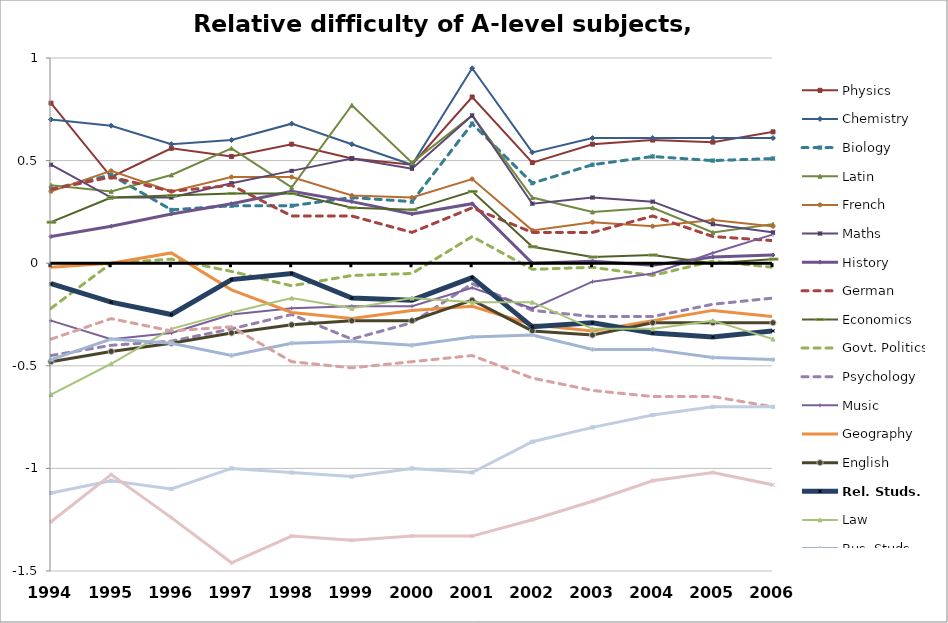
| Category | Physics | Chemistry | Biology | Latin | French | Maths | History | German | Economics | Govt. Politics | Psychology | Music | Geography | English | Rel. Studs. | Law | Bus. Studs. | Sociology | Art | Photography |
|---|---|---|---|---|---|---|---|---|---|---|---|---|---|---|---|---|---|---|---|---|
| 1994.0 | 0.78 | 0.7 | 0.36 | 0.38 | 0.35 | 0.48 | 0.13 | 0.36 | 0.2 | -0.22 | -0.45 | -0.28 | -0.02 | -0.48 | -0.1 | -0.64 | -0.47 | -0.37 | -1.12 | -1.26 |
| 1995.0 | 0.42 | 0.67 | 0.43 | 0.35 | 0.45 | 0.32 | 0.18 | 0.42 | 0.32 | 0 | -0.4 | -0.37 | 0 | -0.43 | -0.19 | -0.49 | -0.37 | -0.27 | -1.06 | -1.03 |
| 1996.0 | 0.56 | 0.58 | 0.26 | 0.43 | 0.35 | 0.32 | 0.24 | 0.35 | 0.33 | 0.02 | -0.38 | -0.34 | 0.05 | -0.39 | -0.25 | -0.32 | -0.39 | -0.33 | -1.1 | -1.24 |
| 1997.0 | 0.52 | 0.6 | 0.28 | 0.56 | 0.42 | 0.39 | 0.29 | 0.38 | 0.34 | -0.04 | -0.32 | -0.25 | -0.13 | -0.34 | -0.08 | -0.24 | -0.45 | -0.31 | -1 | -1.46 |
| 1998.0 | 0.58 | 0.68 | 0.28 | 0.37 | 0.42 | 0.45 | 0.35 | 0.23 | 0.34 | -0.11 | -0.25 | -0.22 | -0.24 | -0.3 | -0.05 | -0.17 | -0.39 | -0.48 | -1.02 | -1.33 |
| 1999.0 | 0.51 | 0.58 | 0.32 | 0.77 | 0.33 | 0.51 | 0.3 | 0.23 | 0.27 | -0.06 | -0.37 | -0.21 | -0.27 | -0.28 | -0.17 | -0.22 | -0.38 | -0.51 | -1.04 | -1.35 |
| 2000.0 | 0.48 | 0.48 | 0.3 | 0.49 | 0.32 | 0.46 | 0.24 | 0.15 | 0.26 | -0.05 | -0.29 | -0.21 | -0.23 | -0.28 | -0.18 | -0.17 | -0.4 | -0.48 | -1 | -1.33 |
| 2001.0 | 0.81 | 0.95 | 0.68 | 0.72 | 0.41 | 0.72 | 0.29 | 0.27 | 0.35 | 0.13 | -0.1 | -0.12 | -0.21 | -0.18 | -0.07 | -0.19 | -0.36 | -0.45 | -1.02 | -1.33 |
| 2002.0 | 0.49 | 0.54 | 0.39 | 0.32 | 0.16 | 0.29 | 0 | 0.15 | 0.08 | -0.03 | -0.23 | -0.22 | -0.3 | -0.33 | -0.31 | -0.19 | -0.35 | -0.56 | -0.87 | -1.25 |
| 2003.0 | 0.58 | 0.61 | 0.48 | 0.25 | 0.2 | 0.32 | 0.01 | 0.15 | 0.03 | -0.02 | -0.26 | -0.09 | -0.33 | -0.35 | -0.29 | -0.32 | -0.42 | -0.62 | -0.8 | -1.16 |
| 2004.0 | 0.6 | 0.61 | 0.52 | 0.27 | 0.18 | 0.3 | -0.01 | 0.23 | 0.04 | -0.06 | -0.26 | -0.05 | -0.28 | -0.29 | -0.34 | -0.32 | -0.42 | -0.65 | -0.74 | -1.06 |
| 2005.0 | 0.59 | 0.61 | 0.5 | 0.15 | 0.21 | 0.19 | 0.03 | 0.13 | 0 | 0.01 | -0.2 | 0.05 | -0.23 | -0.29 | -0.36 | -0.28 | -0.46 | -0.65 | -0.7 | -1.02 |
| 2006.0 | 0.64 | 0.61 | 0.51 | 0.19 | 0.18 | 0.15 | 0.04 | 0.11 | 0.02 | -0.02 | -0.17 | 0.14 | -0.26 | -0.29 | -0.33 | -0.37 | -0.47 | -0.7 | -0.7 | -1.08 |